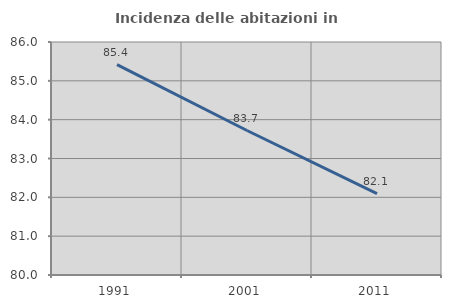
| Category | Incidenza delle abitazioni in proprietà  |
|---|---|
| 1991.0 | 85.417 |
| 2001.0 | 83.721 |
| 2011.0 | 82.095 |